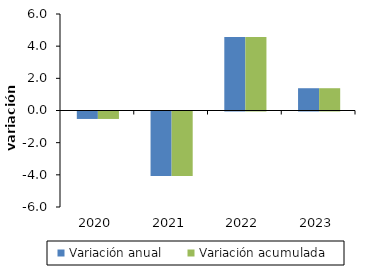
| Category | Variación anual | Variación acumulada |
|---|---|---|
| 2020-01-01 | -0.464 | -0.464 |
| 2021-01-01 | -4.017 | -4.017 |
| 2022-01-01 | 4.567 | 4.567 |
| 2023-01-01 | 1.385 | 1.385 |